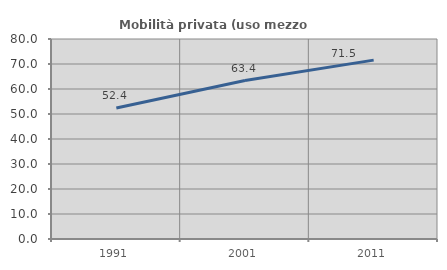
| Category | Mobilità privata (uso mezzo privato) |
|---|---|
| 1991.0 | 52.375 |
| 2001.0 | 63.394 |
| 2011.0 | 71.548 |